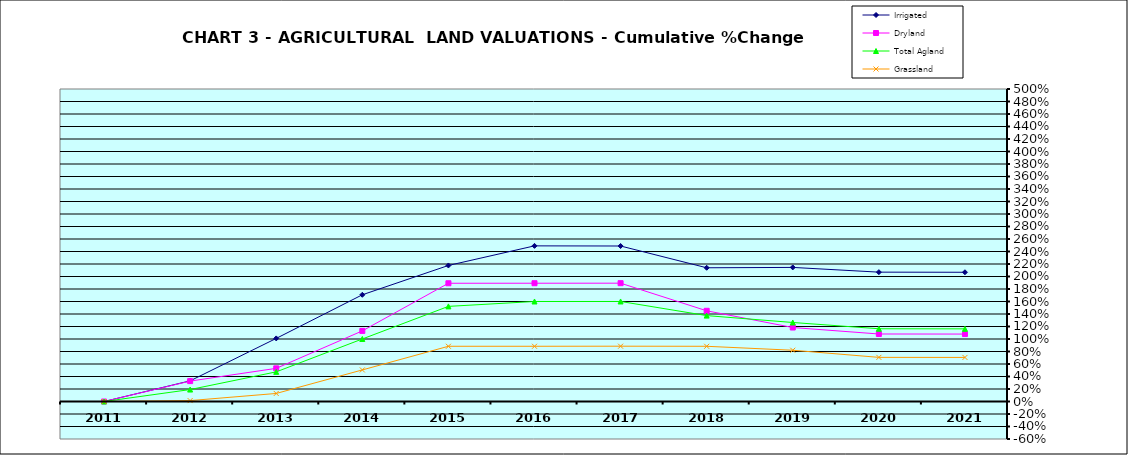
| Category | Irrigated | Dryland | Total Agland | Grassland |
|---|---|---|---|---|
| 2011.0 | 0 | 0 | 0 | 0 |
| 2012.0 | 0.33 | 0.326 | 0.191 | 0.015 |
| 2013.0 | 1.009 | 0.53 | 0.474 | 0.129 |
| 2014.0 | 1.707 | 1.13 | 1 | 0.505 |
| 2015.0 | 2.177 | 1.892 | 1.522 | 0.884 |
| 2016.0 | 2.49 | 1.892 | 1.6 | 0.884 |
| 2017.0 | 2.488 | 1.893 | 1.6 | 0.885 |
| 2018.0 | 2.14 | 1.451 | 1.374 | 0.883 |
| 2019.0 | 2.145 | 1.184 | 1.264 | 0.82 |
| 2020.0 | 2.07 | 1.08 | 1.164 | 0.706 |
| 2021.0 | 2.068 | 1.079 | 1.162 | 0.705 |